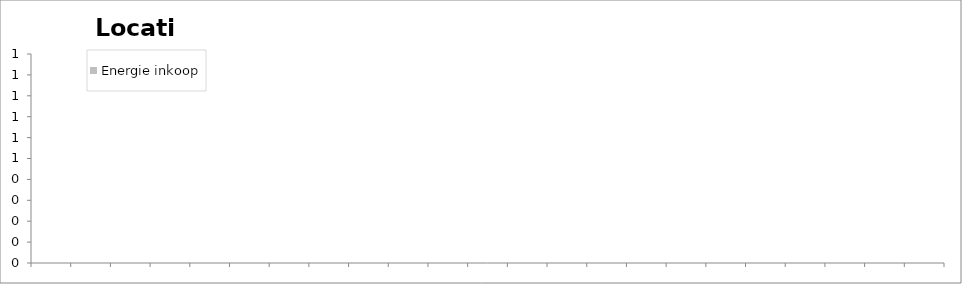
| Category | Energie inkoop |
|---|---|
| 0 | 0 |
| 1 | 0 |
| 2 | 0 |
| 3 | 0 |
| 4 | 0 |
| 5 | 0 |
| 6 | 0 |
| 7 | 0 |
| 8 | 0 |
| 9 | 0 |
| 10 | 0 |
| 11 | 0 |
| 12 | 0 |
| 13 | 0 |
| 14 | 0 |
| 15 | 0 |
| 16 | 0 |
| 17 | 0 |
| 18 | 0 |
| 19 | 0 |
| 20 | 0 |
| 21 | 0 |
| 22 | 0 |
| 23 | 0 |